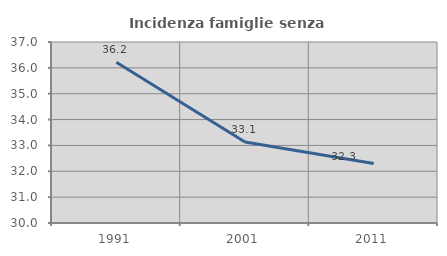
| Category | Incidenza famiglie senza nuclei |
|---|---|
| 1991.0 | 36.216 |
| 2001.0 | 33.129 |
| 2011.0 | 32.298 |